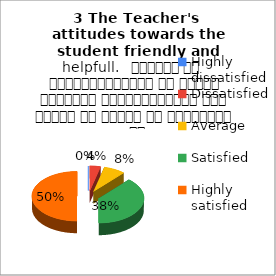
| Category | 3 The Teacher's  attitudes towards the student friendly and helpfull.   शिक्षक का विद्यार्थियों के प्रति व्यवहार मित्रतापूर्ण एवम सहयोग के भावना से परिपूर्ण था |
|---|---|
| Highly dissatisfied | 0 |
| Dissatisfied | 1 |
| Average | 2 |
| Satisfied | 10 |
| Highly satisfied | 13 |